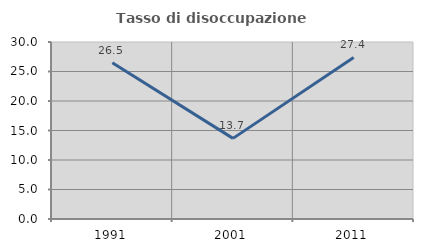
| Category | Tasso di disoccupazione giovanile  |
|---|---|
| 1991.0 | 26.495 |
| 2001.0 | 13.666 |
| 2011.0 | 27.392 |